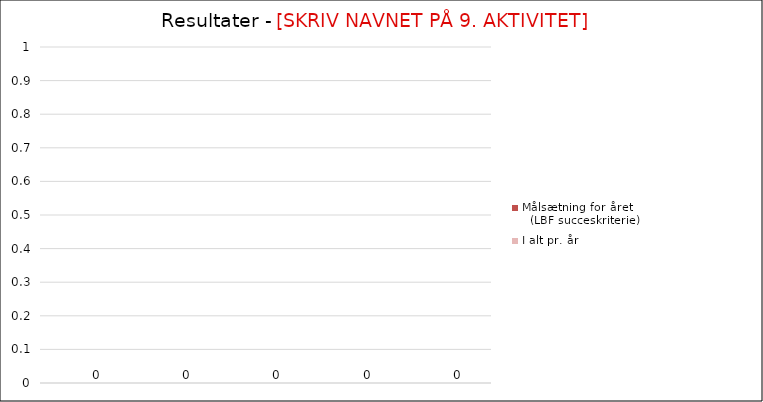
| Category | Målsætning for året                                           (LBF succeskriterie) | I alt pr. år |
|---|---|---|
|  |  | 0 |
|  |  | 0 |
|  |  | 0 |
|  |  | 0 |
|  |  | 0 |